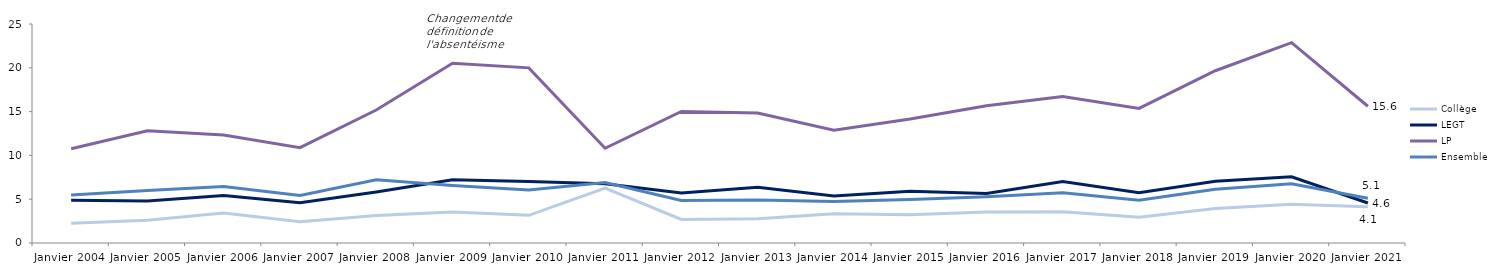
| Category | Collège | LEGT | LP | Ensemble |
|---|---|---|---|---|
| Janvier 2004 | 2.244 | 4.894 | 10.756 | 5.475 |
| Janvier 2005 | 2.6 | 4.8 | 12.8 | 6 |
| Janvier 2006 | 3.415 | 5.431 | 12.316 | 6.462 |
| Janvier 2007 | 2.413 | 4.607 | 10.885 | 5.435 |
| Janvier 2008 | 3.128 | 5.827 | 15.177 | 7.207 |
| Janvier 2009 | 3.53 | 7.217 | 20.518 | 6.571 |
| Janvier 2010 | 3.155 | 7.016 | 19.993 | 6.044 |
| Janvier 2011 | 6.274 | 6.751 | 10.817 | 6.911 |
| Janvier 2012 | 2.693 | 5.696 | 15.01 | 4.849 |
| Janvier 2013 | 2.772 | 6.376 | 14.844 | 4.904 |
| Janvier 2014 | 3.341 | 5.36 | 12.869 | 4.73 |
| Janvier 2015 | 3.237 | 5.915 | 14.156 | 4.976 |
| Janvier 2016 | 3.55 | 5.648 | 15.671 | 5.285 |
| Janvier 2017 | 3.556 | 7.029 | 16.721 | 5.731 |
| Janvier 2018 | 2.931 | 5.737 | 15.362 | 4.873 |
| Janvier 2019 | 3.95 | 7.05 | 19.665 | 6.145 |
| Janvier 2020 | 4.414 | 7.559 | 22.869 | 6.766 |
| Janvier 2021 | 4.144 | 4.563 | 15.611 | 5.115 |